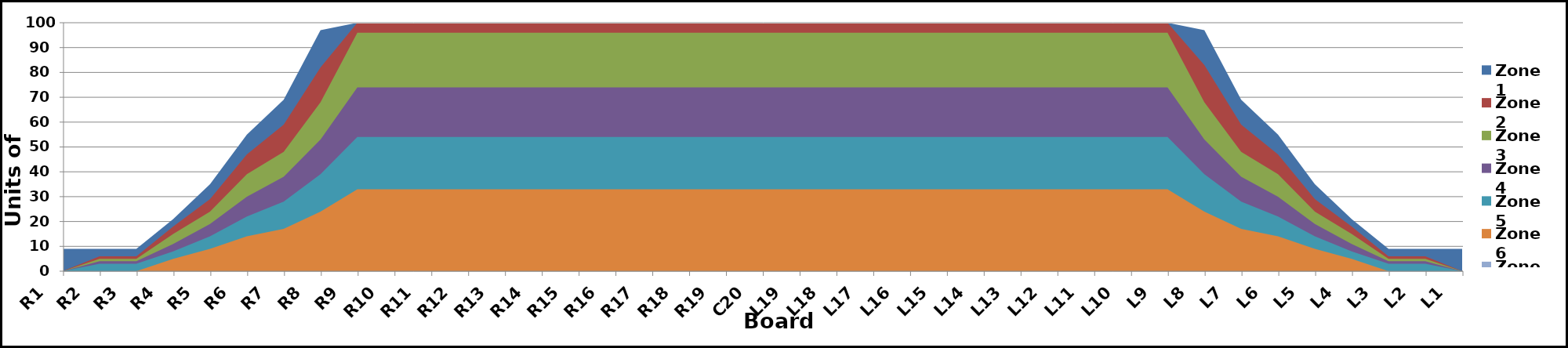
| Category | Zone 1 | Zone 2 | Zone 3 | Zone 4 | Zone 5 | Zone 6 | Zone 7 | Zone 8 |
|---|---|---|---|---|---|---|---|---|
| L1 | 9 | 0 | 0 | 0 | 0 | 0 | 0 | 0 |
| L2 | 9 | 6 | 5 | 4 | 3 | 0 | 0 | 0 |
| L3 | 9 | 6 | 5 | 4 | 3 | 0 | 0 | 0 |
| L4 | 21 | 18 | 15 | 11 | 8 | 5 | 0 | 0 |
| L5 | 35 | 29 | 24 | 19 | 14 | 9 | 0 | 0 |
| L6 | 55 | 47 | 39 | 30 | 22 | 14 | 0 | 0 |
| L7 | 69 | 59 | 48 | 38 | 28 | 17 | 0 | 0 |
| L8 | 97 | 83 | 68 | 53 | 39 | 24 | 0 | 0 |
| L9 | 100 | 100 | 96 | 74 | 54 | 33 | 0 | 0 |
| L10 | 100 | 100 | 96 | 74 | 54 | 33 | 0 | 0 |
| L11 | 100 | 100 | 96 | 74 | 54 | 33 | 0 | 0 |
| L12 | 100 | 100 | 96 | 74 | 54 | 33 | 0 | 0 |
| L13 | 100 | 100 | 96 | 74 | 54 | 33 | 0 | 0 |
| L14 | 100 | 100 | 96 | 74 | 54 | 33 | 0 | 0 |
| L15 | 100 | 100 | 96 | 74 | 54 | 33 | 0 | 0 |
| L16 | 100 | 100 | 96 | 74 | 54 | 33 | 0 | 0 |
| L17 | 100 | 100 | 96 | 74 | 54 | 33 | 0 | 0 |
| L18 | 100 | 100 | 96 | 74 | 54 | 33 | 0 | 0 |
| L19 | 100 | 100 | 96 | 74 | 54 | 33 | 0 | 0 |
| C20 | 100 | 100 | 96 | 74 | 54 | 33 | 0 | 0 |
| R19 | 100 | 100 | 96 | 74 | 54 | 33 | 0 | 0 |
| R18 | 100 | 100 | 96 | 74 | 54 | 33 | 0 | 0 |
| R17 | 100 | 100 | 96 | 74 | 54 | 33 | 0 | 0 |
| R16 | 100 | 100 | 96 | 74 | 54 | 33 | 0 | 0 |
| R15 | 100 | 100 | 96 | 74 | 54 | 33 | 0 | 0 |
| R14 | 100 | 100 | 96 | 74 | 54 | 33 | 0 | 0 |
| R13 | 100 | 100 | 96 | 74 | 54 | 33 | 0 | 0 |
| R12 | 100 | 100 | 96 | 74 | 54 | 33 | 0 | 0 |
| R11 | 100 | 100 | 96 | 74 | 54 | 33 | 0 | 0 |
| R10 | 100 | 100 | 96 | 74 | 54 | 33 | 0 | 0 |
| R9 | 100 | 100 | 96 | 74 | 54 | 33 | 0 | 0 |
| R8 | 97 | 82 | 68 | 53 | 39 | 24 | 0 | 0 |
| R7 | 69 | 59 | 48 | 38 | 28 | 17 | 0 | 0 |
| R6 | 55 | 47 | 39 | 30 | 22 | 14 | 0 | 0 |
| R5 | 35 | 29 | 24 | 19 | 14 | 9 | 0 | 0 |
| R4 | 21 | 18 | 15 | 11 | 8 | 5 | 0 | 0 |
| R3 | 9 | 6 | 5 | 4 | 3 | 0 | 0 | 0 |
| R2 | 9 | 6 | 5 | 4 | 3 | 0 | 0 | 0 |
| R1 | 9 | 0 | 0 | 0 | 0 | 0 | 0 | 0 |